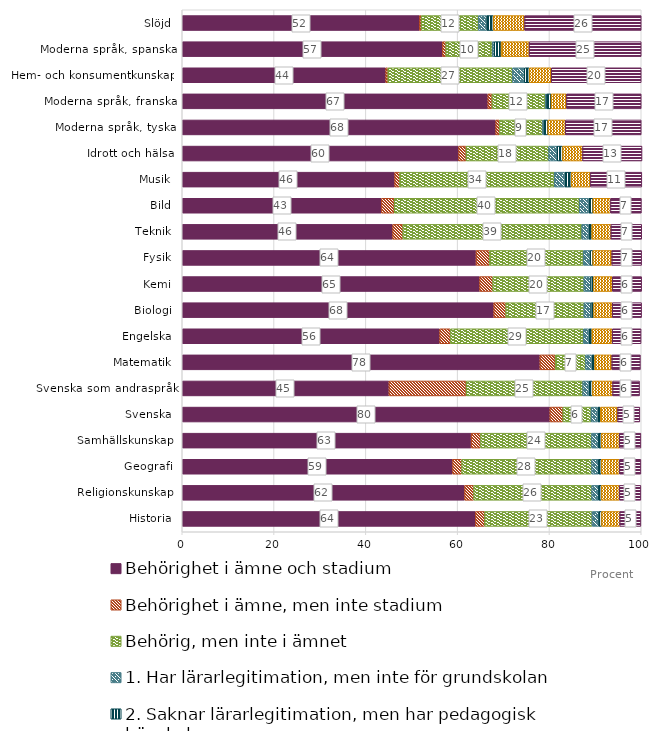
| Category | Behörighet i ämne och stadium | Behörighet i ämne, men inte stadium | Behörig, men inte i ämnet | 1. Har lärarlegitimation, men inte för grundskolan | 2. Saknar lärarlegitimation, men har pedagogisk högskoleexamen | 3. Har inte pedagogisk examen, men viss eftergymnasial pedagogisk utbildning | 4. Saknar eftergymnasial pedagogisk utbildning |
|---|---|---|---|---|---|---|---|
| Historia | 63.869 | 2.02 | 23.38 | 1.501 | 0.593 | 3.949 | 4.613 |
| Religionskunskap | 61.503 | 1.991 | 25.71 | 1.507 | 0.594 | 3.93 | 4.685 |
| Geografi | 58.895 | 1.979 | 28.321 | 1.499 | 0.597 | 3.948 | 4.686 |
| Samhällskunskap | 62.942 | 2.03 | 24.193 | 1.538 | 0.583 | 3.934 | 4.704 |
| Svenska | 80.092 | 2.829 | 6.142 | 1.472 | 0.552 | 3.769 | 4.84 |
| Svenska som andraspråk | 45.036 | 16.816 | 25.394 | 1.402 | 0.732 | 4.382 | 5.877 |
| Matematik | 77.924 | 3.33 | 6.59 | 1.403 | 0.586 | 3.756 | 6.236 |
| Engelska | 56.078 | 2.346 | 28.952 | 1.223 | 0.651 | 4.425 | 6.296 |
| Biologi | 67.865 | 2.613 | 17.023 | 1.544 | 0.576 | 4.064 | 6.398 |
| Kemi | 64.78 | 2.848 | 19.857 | 1.522 | 0.581 | 4.108 | 6.4 |
| Fysik | 64.011 | 2.916 | 20.423 | 1.516 | 0.588 | 4.126 | 6.511 |
| Teknik | 45.84 | 2.203 | 38.993 | 1.532 | 0.636 | 4.184 | 6.719 |
| Bild | 43.378 | 2.801 | 40.308 | 2.078 | 0.912 | 3.818 | 6.744 |
| Musik | 46.286 | 1.069 | 33.684 | 2.315 | 1.391 | 4.172 | 11.211 |
| Idrott och hälsa | 60.198 | 1.635 | 17.991 | 1.839 | 1.21 | 4.339 | 12.961 |
| Moderna språk, tyska | 68.298 | 0.816 | 9.382 | 0.233 | 0.932 | 3.788 | 16.55 |
| Moderna språk, franska | 66.581 | 0.901 | 11.59 | 0.258 | 1.03 | 3.348 | 16.613 |
| Hem- och konsumentkunskap | 44.335 | 0.464 | 27.136 | 2.594 | 1.092 | 4.778 | 19.902 |
| Moderna språk, spanska | 56.684 | 0.73 | 10.117 | 0.438 | 1.497 | 6.099 | 24.763 |
| Slöjd | 51.653 | 0.405 | 12.444 | 1.782 | 1.498 | 6.803 | 25.793 |